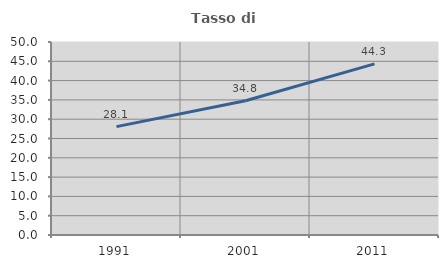
| Category | Tasso di occupazione   |
|---|---|
| 1991.0 | 28.082 |
| 2001.0 | 34.783 |
| 2011.0 | 44.348 |